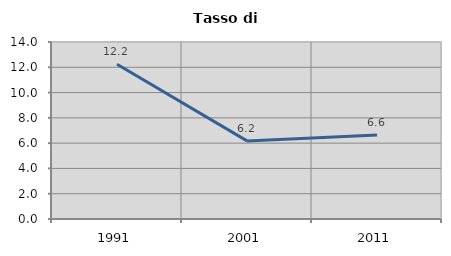
| Category | Tasso di disoccupazione   |
|---|---|
| 1991.0 | 12.238 |
| 2001.0 | 6.179 |
| 2011.0 | 6.647 |